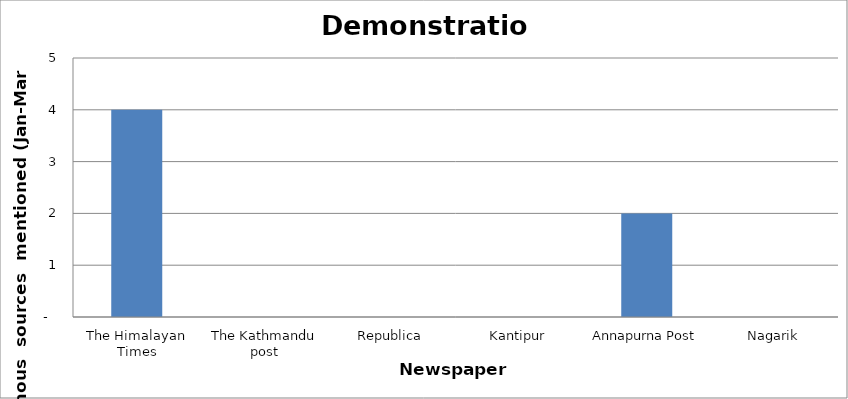
| Category | Demonstration |
|---|---|
| The Himalayan Times | 4 |
| The Kathmandu post | 0 |
| Republica | 0 |
| Kantipur | 0 |
| Annapurna Post | 2 |
| Nagarik | 0 |